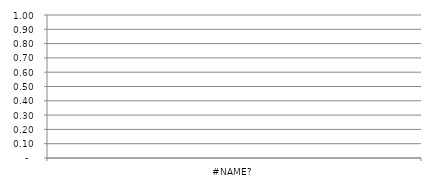
| Category | Series 1 |
|---|---|
|  #SQL Error  | 0 |
|  #SQL Error  | 0 |
|  #SQL Error  | 0 |
|  #SQL Error  | 0 |
|  #SQL Error  | 0 |
|  #SQL Error  | 0 |
|  #SQL Error  | 0 |
|  #SQL Error  | 0 |
|  #SQL Error  | 0 |